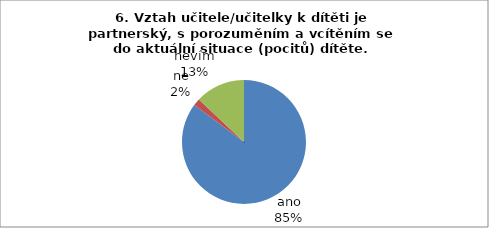
| Category | 6. |
|---|---|
| ano | 46 |
| ne | 1 |
| nevím | 7 |